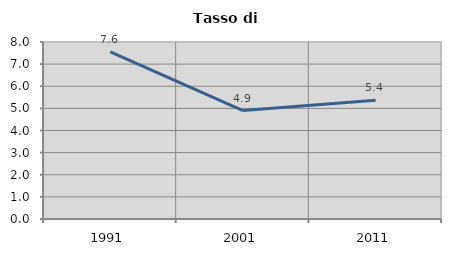
| Category | Tasso di disoccupazione   |
|---|---|
| 1991.0 | 7.558 |
| 2001.0 | 4.901 |
| 2011.0 | 5.371 |